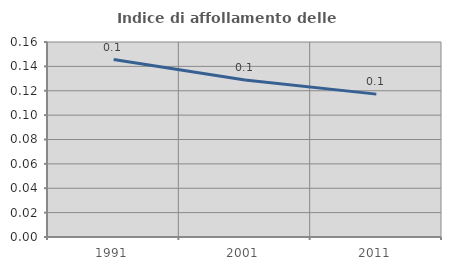
| Category | Indice di affollamento delle abitazioni  |
|---|---|
| 1991.0 | 0.146 |
| 2001.0 | 0.129 |
| 2011.0 | 0.117 |